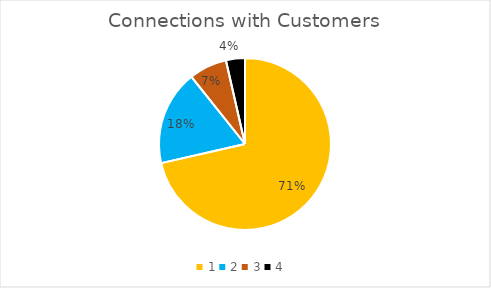
| Category | Series 0 |
|---|---|
| 0 | 0.714 |
| 1 | 0.179 |
| 2 | 0.071 |
| 3 | 0.036 |